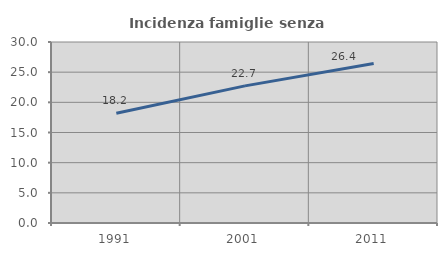
| Category | Incidenza famiglie senza nuclei |
|---|---|
| 1991.0 | 18.182 |
| 2001.0 | 22.724 |
| 2011.0 | 26.429 |